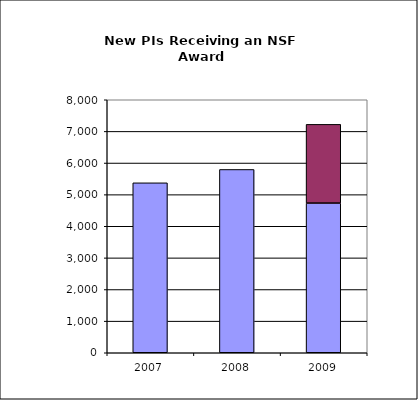
| Category | Regular Appropriation | ARRA |
|---|---|---|
| 2007.0 | 5374 | 0 |
| 2008.0 | 5796 | 0 |
| 2009.0 | 4733 | 2489 |